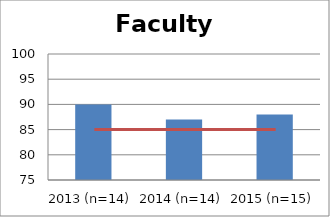
| Category | Faculty Satisfaction |
|---|---|
| 2013 (n=14) | 90 |
| 2014 (n=14) | 87 |
| 2015 (n=15) | 88 |